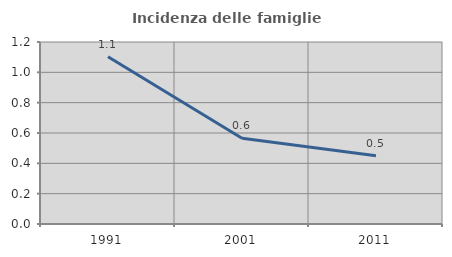
| Category | Incidenza delle famiglie numerose |
|---|---|
| 1991.0 | 1.103 |
| 2001.0 | 0.566 |
| 2011.0 | 0.45 |